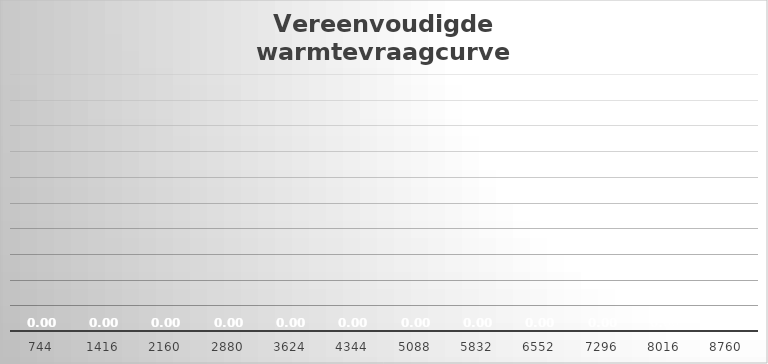
| Category | 744 |
|---|---|
| 744.0 | 0 |
| 1416.0 | 0 |
| 2160.0 | 0 |
| 2880.0 | 0 |
| 3624.0 | 0 |
| 4344.0 | 0 |
| 5088.0 | 0 |
| 5832.0 | 0 |
| 6552.0 | 0 |
| 7296.0 | 0 |
| 8016.0 | 0 |
| 8760.0 | 0 |